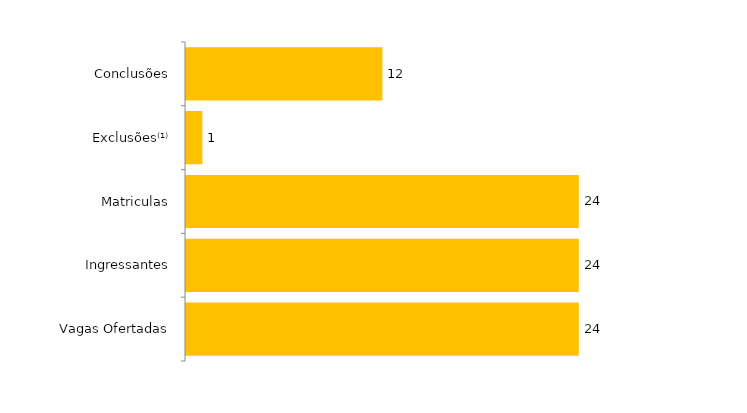
| Category | Total (2013) |
|---|---|
| Vagas Ofertadas | 24 |
| Ingressantes | 24 |
| Matriculas | 24 |
| Exclusões⁽¹⁾ | 1 |
| Conclusões | 12 |